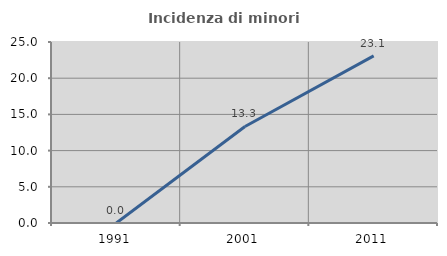
| Category | Incidenza di minori stranieri |
|---|---|
| 1991.0 | 0 |
| 2001.0 | 13.333 |
| 2011.0 | 23.077 |